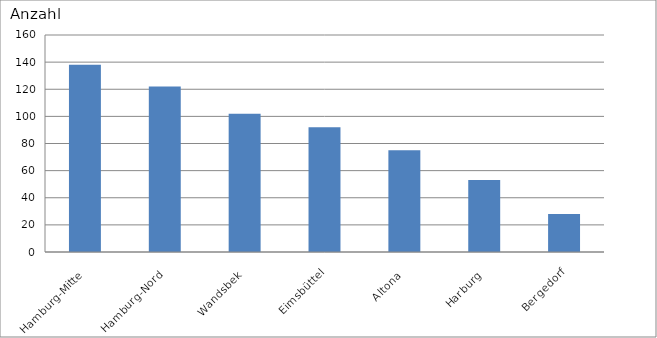
| Category | Hamburg-Mitte Hamburg-Nord Wandsbek Eimsbüttel Altona Harburg Bergedorf |
|---|---|
| Hamburg-Mitte | 138 |
| Hamburg-Nord | 122 |
| Wandsbek | 102 |
| Eimsbüttel | 92 |
| Altona | 75 |
| Harburg | 53 |
| Bergedorf | 28 |